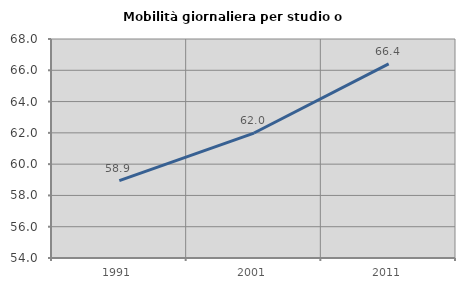
| Category | Mobilità giornaliera per studio o lavoro |
|---|---|
| 1991.0 | 58.945 |
| 2001.0 | 61.988 |
| 2011.0 | 66.405 |